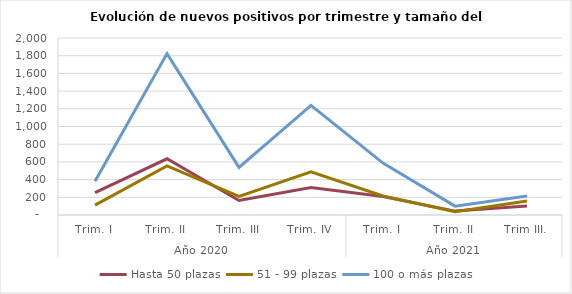
| Category | Hasta 50 plazas | 51 - 99 plazas | 100 o más plazas |
|---|---|---|---|
| 0 | 253 | 111 | 381 |
| 1 | 635 | 555 | 1824 |
| 2 | 164 | 210 | 538 |
| 3 | 311 | 488 | 1239 |
| 4 | 208 | 215 | 586 |
| 5 | 44 | 38 | 100 |
| 6 | 103 | 159 | 215 |